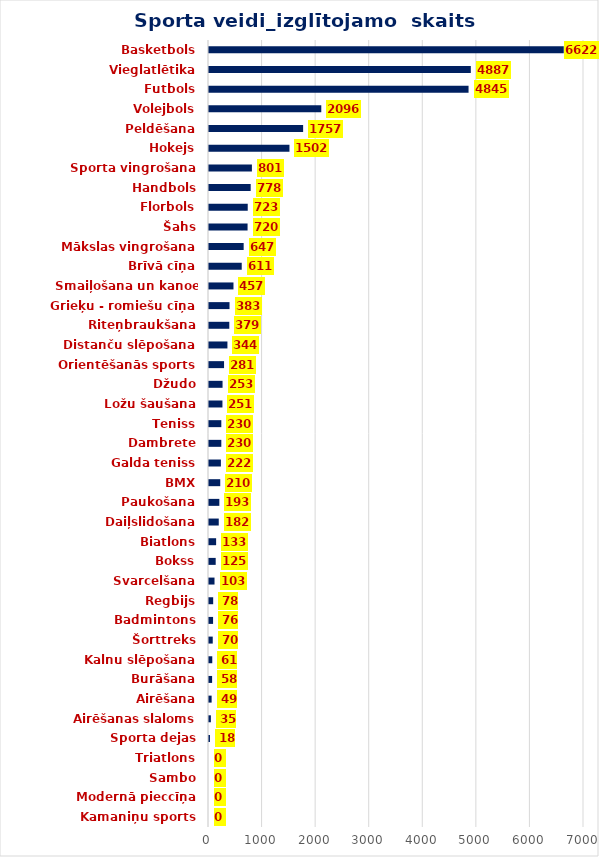
| Category | Audzēkņu
 skaits |
|---|---|
| Kamaniņu sports | 0 |
| Modernā pieccīņa | 0 |
| Sambo | 0 |
| Triatlons | 0 |
| Sporta dejas | 18 |
| Airēšanas slaloms | 35 |
| Airēšana | 49 |
| Burāšana | 58 |
| Kalnu slēpošana | 61 |
| Šorttreks | 70 |
| Badmintons | 76 |
| Regbijs | 78 |
| Svarcelšana | 103 |
| Bokss | 125 |
| Biatlons | 133 |
| Daiļslidošana | 182 |
| Paukošana | 193 |
| BMX | 210 |
| Galda teniss | 222 |
| Dambrete | 230 |
| Teniss | 230 |
| Ložu šaušana | 251 |
| Džudo | 253 |
| Orientēšanās sports | 281 |
| Distanču slēpošana | 344 |
| Riteņbraukšana | 379 |
| Grieķu - romiešu cīņa | 383 |
| Smaiļošana un kanoe airēšana | 457 |
| Brīvā cīņa | 611 |
| Mākslas vingrošana | 647 |
| Šahs | 720 |
| Florbols | 723 |
| Handbols | 778 |
| Sporta vingrošana | 801 |
| Hokejs | 1502 |
| Peldēšana | 1757 |
| Volejbols | 2096 |
| Futbols | 4845 |
| Vieglatlētika | 4887 |
| Basketbols | 6622 |